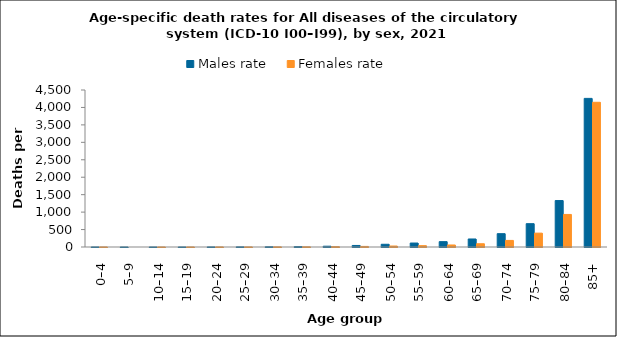
| Category | Males rate | Females rate |
|---|---|---|
| 0–4 | 0.902 | 1.09 |
| 5–9 | 0.361 | 0 |
| 10–14 | 0.12 | 0.38 |
| 15–19 | 0.525 | 0.697 |
| 20–24 | 1.792 | 1.526 |
| 25–29 | 3.92 | 1.992 |
| 30–34 | 6.592 | 3.858 |
| 35–39 | 11.419 | 5.218 |
| 40–44 | 22.552 | 10.017 |
| 45–49 | 44.047 | 16.692 |
| 50–54 | 77.944 | 27.771 |
| 55–59 | 113.699 | 38.834 |
| 60–64 | 153.264 | 58.103 |
| 65–69 | 229.946 | 93.268 |
| 70–74 | 382.014 | 188.15 |
| 75–79 | 668.313 | 396.802 |
| 80–84 | 1331.402 | 933.165 |
| 85+ | 4259.711 | 4147.577 |